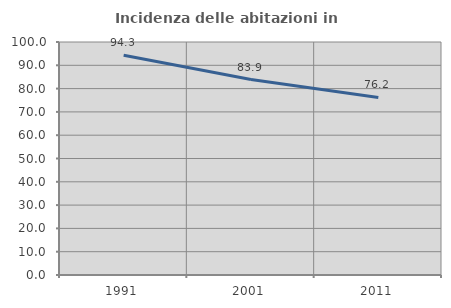
| Category | Incidenza delle abitazioni in proprietà  |
|---|---|
| 1991.0 | 94.286 |
| 2001.0 | 83.902 |
| 2011.0 | 76.216 |